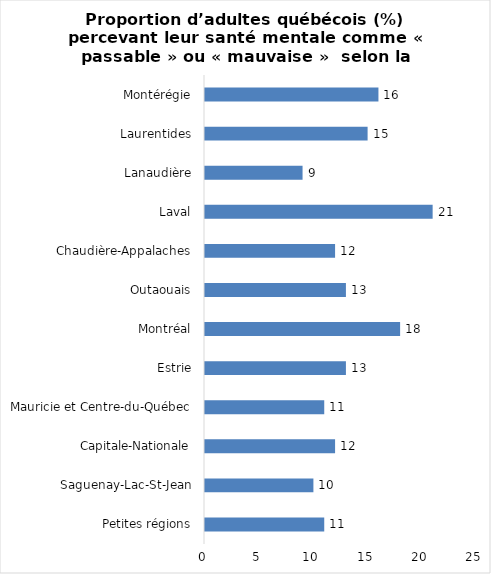
| Category | Series 0 |
|---|---|
| Petites régions | 11 |
| Saguenay-Lac-St-Jean | 10 |
| Capitale-Nationale | 12 |
| Mauricie et Centre-du-Québec | 11 |
| Estrie | 13 |
| Montréal | 18 |
| Outaouais | 13 |
| Chaudière-Appalaches | 12 |
| Laval | 21 |
| Lanaudière | 9 |
| Laurentides | 15 |
| Montérégie | 16 |